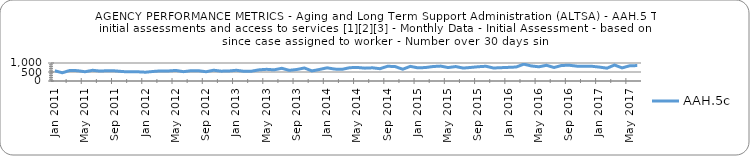
| Category | AAH.5c |
|---|---|
| 2011-01-01 | 567 |
| 2011-02-01 | 457 |
| 2011-03-01 | 589 |
| 2011-04-01 | 574 |
| 2011-05-01 | 514 |
| 2011-06-01 | 595 |
| 2011-07-01 | 550 |
| 2011-08-01 | 574 |
| 2011-09-01 | 562 |
| 2011-10-01 | 523 |
| 2011-11-01 | 508 |
| 2011-12-01 | 511 |
| 2012-01-01 | 488 |
| 2012-02-01 | 530 |
| 2012-03-01 | 562 |
| 2012-04-01 | 557 |
| 2012-05-01 | 588 |
| 2012-06-01 | 518 |
| 2012-07-01 | 571 |
| 2012-08-01 | 570 |
| 2012-09-01 | 515 |
| 2012-10-01 | 598 |
| 2012-11-01 | 547 |
| 2012-12-01 | 556 |
| 2013-01-01 | 596 |
| 2013-02-01 | 539 |
| 2013-03-01 | 545 |
| 2013-04-01 | 620 |
| 2013-05-01 | 649 |
| 2013-06-01 | 620 |
| 2013-07-01 | 706 |
| 2013-08-01 | 592 |
| 2013-09-01 | 640 |
| 2013-10-01 | 723 |
| 2013-11-01 | 560 |
| 2013-12-01 | 642 |
| 2014-01-01 | 732 |
| 2014-02-01 | 661 |
| 2014-03-01 | 650 |
| 2014-04-01 | 740 |
| 2014-05-01 | 752 |
| 2014-06-01 | 714 |
| 2014-07-01 | 733 |
| 2014-08-01 | 683 |
| 2014-09-01 | 820 |
| 2014-10-01 | 800 |
| 2014-11-01 | 653 |
| 2014-12-01 | 814 |
| 2015-01-01 | 731 |
| 2015-02-01 | 748 |
| 2015-03-01 | 803 |
| 2015-04-01 | 828 |
| 2015-05-01 | 747 |
| 2015-06-01 | 802 |
| 2015-07-01 | 718 |
| 2015-08-01 | 753 |
| 2015-09-01 | 793 |
| 2015-10-01 | 819 |
| 2015-11-01 | 722 |
| 2015-12-01 | 740 |
| 2016-01-01 | 758 |
| 2016-02-01 | 777 |
| 2016-03-01 | 935 |
| 2016-04-01 | 836 |
| 2016-05-01 | 789 |
| 2016-06-01 | 873 |
| 2016-07-01 | 750 |
| 2016-08-01 | 862 |
| 2016-09-01 | 876 |
| 2016-10-01 | 826 |
| 2016-11-01 | 818 |
| 2016-12-01 | 818 |
| 2017-01-01 | 772 |
| 2017-02-01 | 712 |
| 2017-03-01 | 888 |
| 2017-04-01 | 728 |
| 2017-05-01 | 845 |
| 2017-06-01 | 857 |